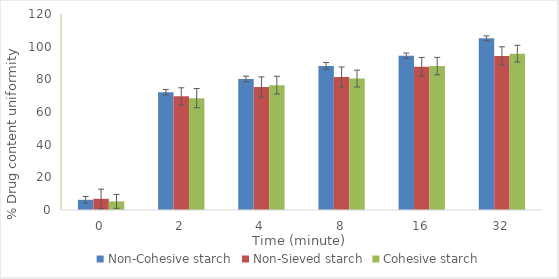
| Category | Non-Cohesive starch | Non-Sieved starch | Cohesive starch |
|---|---|---|---|
| 0.0 | 6.25 | 6.88 | 5.28 |
| 2.0 | 72.14 | 69.57 | 68.48 |
| 4.0 | 80.15 | 75.27 | 76.44 |
| 8.0 | 88.21 | 81.44 | 80.47 |
| 16.0 | 94.43 | 87.64 | 88.11 |
| 32.0 | 105.11 | 94.36 | 95.72 |